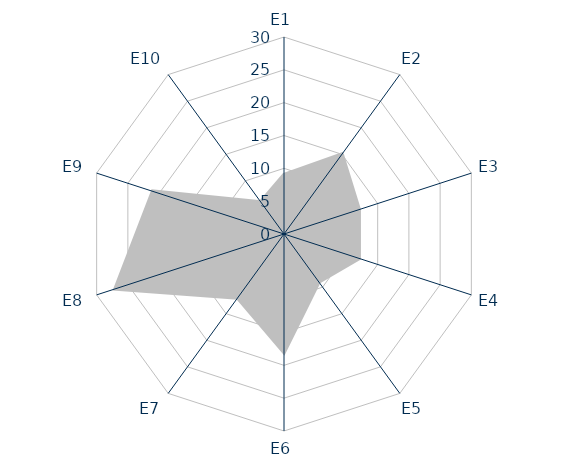
| Category | Series 1 | Series 0 |
|---|---|---|
| E1 | 9 | 0 |
| E2 | 15 | 0 |
| E3 | 12 | 0 |
| E4 | 12 | 0 |
| E5 | 9 | 0 |
| E6 | 18 | 0 |
| E7 | 12 | 0 |
| E8 | 27 | 0 |
| E9 | 21 | 0 |
| E10 | 6 | 0 |